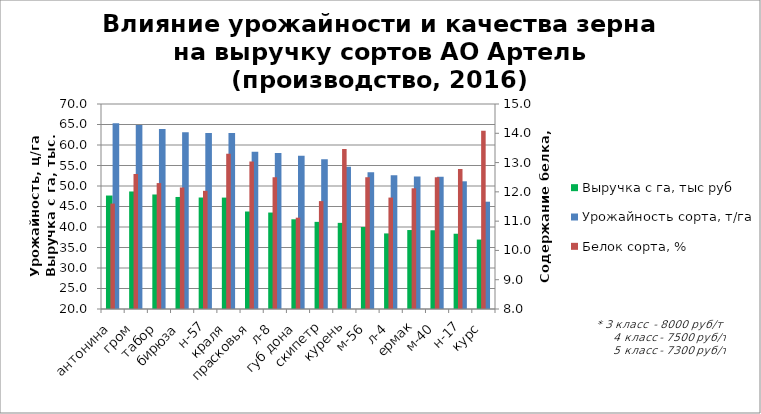
| Category | Выручка с га, тыс руб | Урожайность сорта, т/га |
|---|---|---|
| антонина | 47.675 | 65.308 |
| гром | 48.665 | 64.887 |
| табор | 47.931 | 63.908 |
| бирюза | 47.326 | 63.101 |
| н-57 | 47.193 | 62.924 |
| краля | 47.172 | 62.896 |
| прасковья | 43.78 | 58.373 |
| л-8 | 43.527 | 58.036 |
| губ дона | 41.884 | 57.375 |
| скипетр | 41.253 | 56.512 |
| курень | 41.01 | 54.68 |
| м-56 | 39.996 | 53.327 |
| л-4 | 38.435 | 52.65 |
| ермак | 39.26 | 52.346 |
| м-40 | 39.209 | 52.278 |
| н-17 | 38.358 | 51.143 |
| курс | 36.937 | 46.171 |